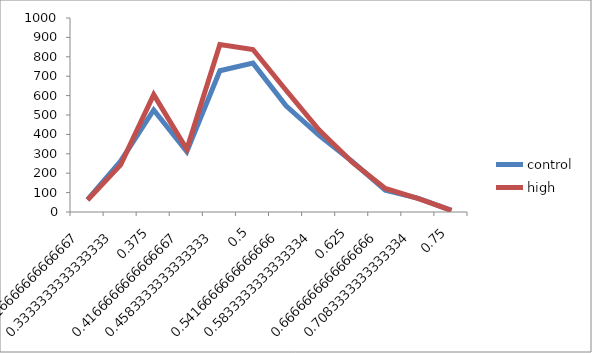
| Category | control | high |
|---|---|---|
| 0.291666666666667 | 63.76 | 61.596 |
| 0.333333333333333 | 261.922 | 242.922 |
| 0.375 | 525.789 | 605.2 |
| 0.416666666666667 | 311.267 | 323.467 |
| 0.458333333333333 | 728.189 | 863.678 |
| 0.5 | 767.5 | 837.389 |
| 0.541666666666667 | 547.089 | 627.622 |
| 0.583333333333333 | 395.444 | 422.644 |
| 0.625 | 260.2 | 256.711 |
| 0.666666666666667 | 112.65 | 121.133 |
| 0.708333333333333 | 70.738 | 69.208 |
| 0.75 | 8.028 | 7.933 |